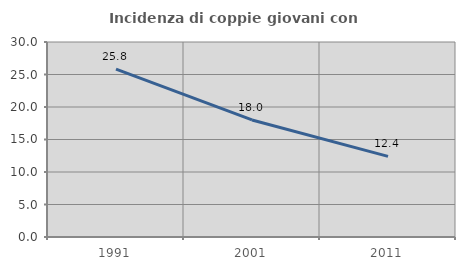
| Category | Incidenza di coppie giovani con figli |
|---|---|
| 1991.0 | 25.838 |
| 2001.0 | 18.007 |
| 2011.0 | 12.397 |